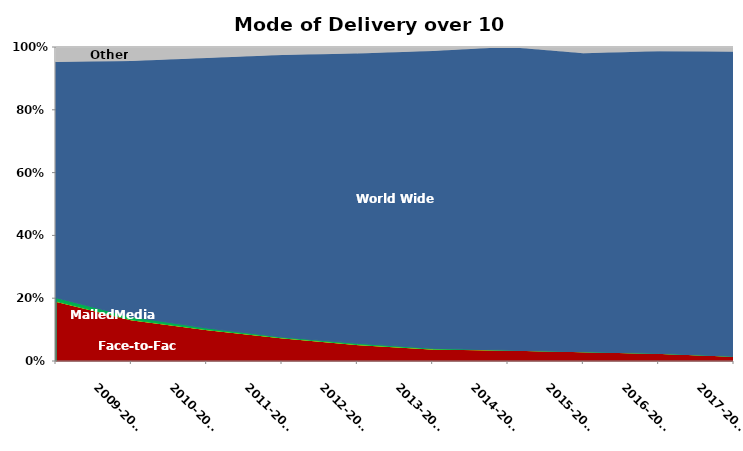
| Category | Face-to-Face  | Iowa Communications Network (ICN) | Mailed Media | World Wide Web | Other |
|---|---|---|---|---|---|
| 2009-2010 | 0.18 | 0 | 0.011 | 0.711 | 0.045 |
| 2010-2011 | 0.123 | 0 | 0.009 | 0.764 | 0.042 |
| 2011-2012 | 0.096 | 0 | 0.005 | 0.826 | 0.034 |
| 2012-2013 | 0.071 | 0 | 0.003 | 0.865 | 0.025 |
| 2013-2014 | 0.051 | 0 | 0.004 | 0.902 | 0.02 |
| 2014-2015 | 0.037 | 0 | 0.002 | 0.925 | 0.013 |
| 2015-2016 | 0.034 | 0 | 0 | 0.948 | 0 |
| 2016-2017 | 0.03 | 0 | 0 | 0.966 | 0.02 |
| 2017-2018 | 0.024 | 0 | 0 | 0.95 | 0.013 |
| 2018-2019 | 0.015 | 0 | 0 | 0.963 | 0.015 |